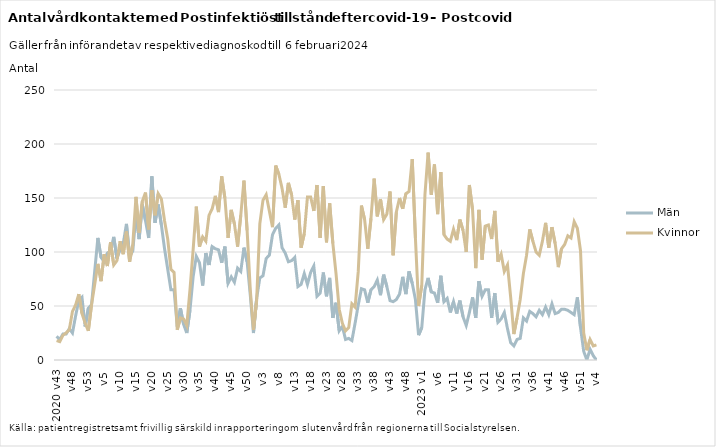
| Category | Män | Kvinnor |
|---|---|---|
| 2020 v43 | 22 | 18 |
| v44 | 19 | 17 |
| v45 | 24 | 23 |
| v46 | 24 | 25 |
| v47 | 29 | 28 |
| v48 | 25 | 45 |
| v49 | 41 | 51 |
| v50 | 55 | 61 |
| v51 | 58 | 43 |
| v52 | 31 | 34 |
| v53 | 48 | 27 |
| 2021 v1 | 51 | 51 |
| v2 | 82 | 70 |
| v3 | 113 | 89 |
| v4 | 95 | 73 |
| v5 | 91 | 98 |
| v6 | 99 | 87 |
| v7 | 101 | 109 |
| v8 | 114 | 88 |
| v9 | 94 | 92 |
| v10 | 103 | 110 |
| v11 | 108 | 98 |
| v12 | 126 | 119 |
| v13 | 96 | 91 |
| v14 | 101 | 107 |
| v15 | 135 | 151 |
| v16 | 112 | 118 |
| v17 | 144 | 147 |
| v18 | 129 | 155 |
| v19 | 113 | 121 |
| v20 | 170 | 157 |
| v21 | 127 | 134 |
| v22 | 144 | 154 |
| v23 | 125 | 149 |
| v24 | 103 | 129 |
| v25 | 84 | 112 |
| v26 | 65 | 84 |
| v27 | 65 | 81 |
| v28 | 31 | 28 |
| v29 | 48 | 39 |
| v30 | 33 | 38 |
| v31 | 25 | 32 |
| v32 | 46 | 65 |
| v33 | 77 | 102 |
| v34 | 96 | 142 |
| v35 | 90 | 105 |
| v36 | 69 | 114 |
| v37 | 99 | 110 |
| v38 | 88 | 134 |
| v39 | 105 | 140 |
| v40 | 103 | 152 |
| v41 | 102 | 137 |
| v42 | 90 | 170 |
| v43 | 105 | 150 |
| v44 | 71 | 113 |
| v45 | 77 | 139 |
| v46 | 72 | 126 |
| v47 | 85 | 105 |
| v48 | 82 | 134 |
| v49 | 104 | 166 |
| v50 | 91 | 120 |
| v51 | 60 | 65 |
| v52 | 25 | 28 |
| 2022 v1 | 57 | 55 |
| v2 | 76 | 126 |
| v3 | 78 | 148 |
| v4 | 94 | 153 |
| v5 | 97 | 138 |
| v6 | 116 | 123 |
| v7 | 122 | 180 |
| v8 | 125 | 172 |
| v9 | 104 | 159 |
| v10 | 99 | 141 |
| v11 | 91 | 164 |
| v12 | 92 | 153 |
| v13 | 95 | 130 |
| v14 | 68 | 148 |
| v15 | 70 | 104 |
| v16 | 80 | 117 |
| v17 | 70 | 151 |
| v18 | 81 | 151 |
| v19 | 87 | 138 |
| v20 | 59 | 162 |
| v21 | 62 | 113 |
| v22 | 81 | 161 |
| v23 | 59 | 109 |
| v24 | 76 | 145 |
| v25 | 39 | 108 |
| v26 | 53 | 80 |
| v27 | 27 | 47 |
| v28 | 31 | 34 |
| v29 | 19 | 27 |
| v30 | 20 | 30 |
| v31 | 18 | 52 |
| v32 | 34 | 49 |
| v33 | 51 | 82 |
| v34 | 66 | 143 |
| v35 | 65 | 130 |
| v36 | 53 | 103 |
| v37 | 65 | 131 |
| v38 | 68 | 168 |
| v39 | 74 | 133 |
| v40 | 60 | 149 |
| v41 | 79 | 130 |
| v42 | 68 | 135 |
| v43 | 55 | 156 |
| v44 | 54 | 97 |
| v45 | 56 | 137 |
| v46 | 61 | 150 |
| v47 | 77 | 140 |
| v48 | 61 | 154 |
| v49 | 82 | 156 |
| v50 | 71 | 186 |
| v51 | 56 | 113 |
| v52 | 23 | 50 |
| 2023 v1 | 30 | 69 |
| v2 | 65 | 153 |
| v3 | 76 | 192 |
| v4 | 63 | 153 |
| v5 | 62 | 181 |
| v6 | 53 | 135 |
| v7 | 78 | 174 |
| v8 | 54 | 116 |
| v9 | 57 | 112 |
| v10 | 44 | 110 |
| v11 | 54 | 121 |
| v12 | 43 | 111 |
| v13 | 55 | 130 |
| v14 | 40 | 120 |
| v15 | 32 | 100 |
| v16 | 44 | 162 |
| v17 | 58 | 139 |
| v18 | 39 | 85 |
| v19 | 73 | 139 |
| v20 | 59 | 93 |
| v21 | 65 | 124 |
| v22 | 65 | 125 |
| v23 | 39 | 112 |
| v24 | 62 | 138 |
| v25 | 35 | 91 |
| v26 | 38 | 98 |
| v27 | 44 | 82 |
| v28 | 29 | 88 |
| v29 | 16 | 58 |
| v30 | 13 | 24 |
| v31 | 19 | 39 |
| v32 | 20 | 56 |
| v33 | 39 | 80 |
| v34 | 36 | 97 |
| v35 | 45 | 121 |
| v36 | 43 | 110 |
| v37 | 40 | 100 |
| v38 | 46 | 97 |
| v39 | 42 | 110 |
| v40 | 49 | 127 |
| v41 | 42 | 104 |
| v42 | 52 | 123 |
| v43 | 43 | 108 |
| v44 | 44 | 86 |
| v45 | 47 | 103 |
| v46 | 47 | 107 |
| v47 | 46 | 115 |
| v48 | 44 | 113 |
| v49 | 42 | 128 |
| v50 | 58 | 122 |
| v51 | 30 | 101 |
| v52 | 8 | 25 |
| 2024 v1 | 0 | 9 |
| v2 | 10 | 19 |
| v3 | 4 | 13 |
| v4 | 0 | 14 |